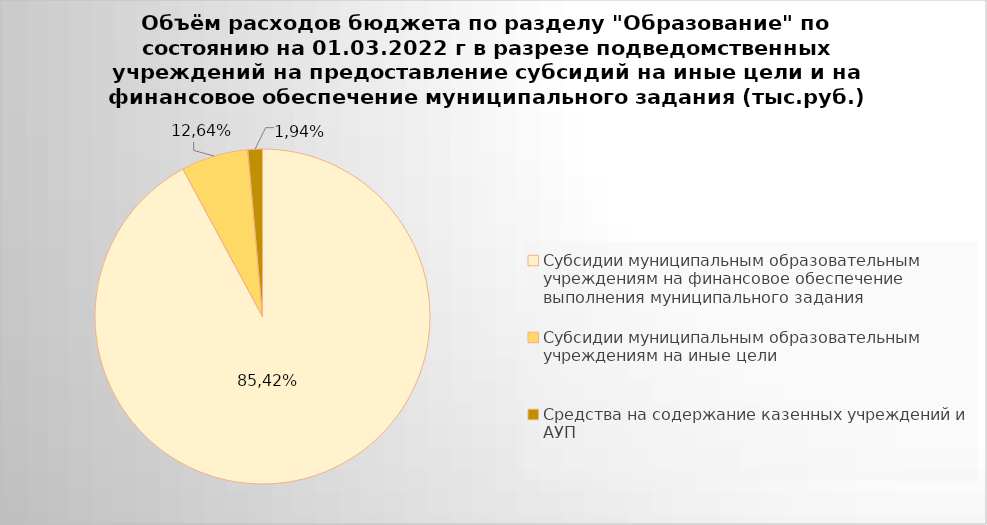
| Category | Series 0 |
|---|---|
| Субсидии муниципальным образовательным учреждениям на финансовое обеспечение выполнения муниципального задания | 7033215.56 |
| Субсидии муниципальным образовательным учреждениям на иные цели | 494059.37 |
| Средства на содержание казенных учреждений и АУП | 107627.3 |